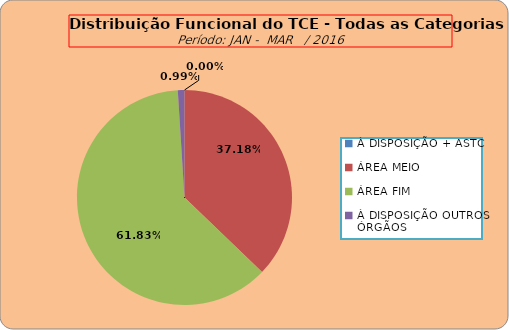
| Category | Series 0 |
|---|---|
| À DISPOSIÇÃO + ASTC | 0 |
| ÁREA MEIO | 187 |
| ÁREA FIM | 311 |
| À DISPOSIÇÃO OUTROS ÓRGÃOS | 5 |